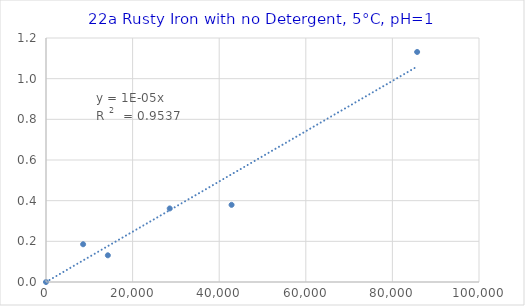
| Category | Series 0 |
|---|---|
| 0.0 | 0 |
| 8571.428571428572 | 0.186 |
| 14285.714285714286 | 0.131 |
| 28571.428571428572 | 0.362 |
| 42857.14285714286 | 0.379 |
| 85714.28571428572 | 1.131 |